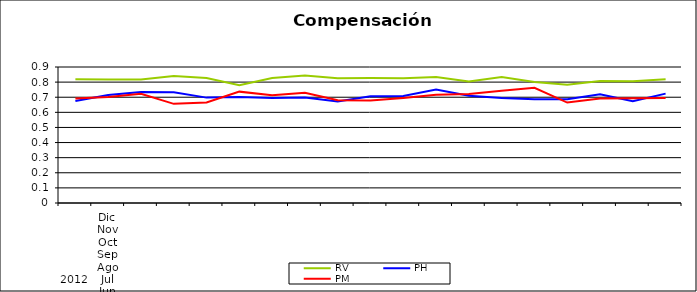
| Category | RV | PH | PM |
|---|---|---|---|
| 0 | 0.819 | 0.675 | 0.691 |
| 1 | 0.818 | 0.714 | 0.701 |
| 2 | 0.817 | 0.734 | 0.722 |
| 3 | 0.84 | 0.732 | 0.656 |
| 4 | 0.827 | 0.697 | 0.666 |
| 5 | 0.78 | 0.701 | 0.737 |
| 6 | 0.827 | 0.695 | 0.713 |
| 7 | 0.844 | 0.699 | 0.73 |
| 8 | 0.826 | 0.672 | 0.68 |
| 9 | 0.827 | 0.706 | 0.678 |
| 10 | 0.826 | 0.709 | 0.696 |
| 11 | 0.834 | 0.751 | 0.717 |
| 12 | 0.804 | 0.709 | 0.721 |
| 13 | 0.834 | 0.694 | 0.743 |
| 14 | 0.802 | 0.687 | 0.763 |
| 15 | 0.783 | 0.687 | 0.665 |
| 16 | 0.807 | 0.72 | 0.692 |
| 17 | 0.805 | 0.674 | 0.693 |
| 18 | 0.82 | 0.724 | 0.695 |